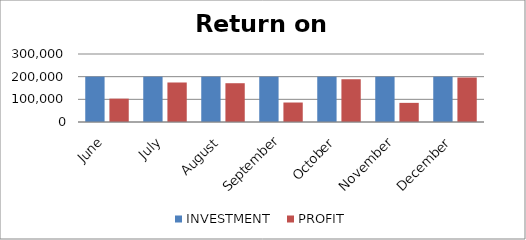
| Category | INVESTMENT  | PROFIT |
|---|---|---|
| June | 200000 | 103075 |
| July | 200000 | 174300 |
| August | 200000 | 171087 |
| September | 200000 | 85937 |
| October | 200000 | 188643 |
| November | 200000 | 84413 |
| December | 200000 | 196325 |